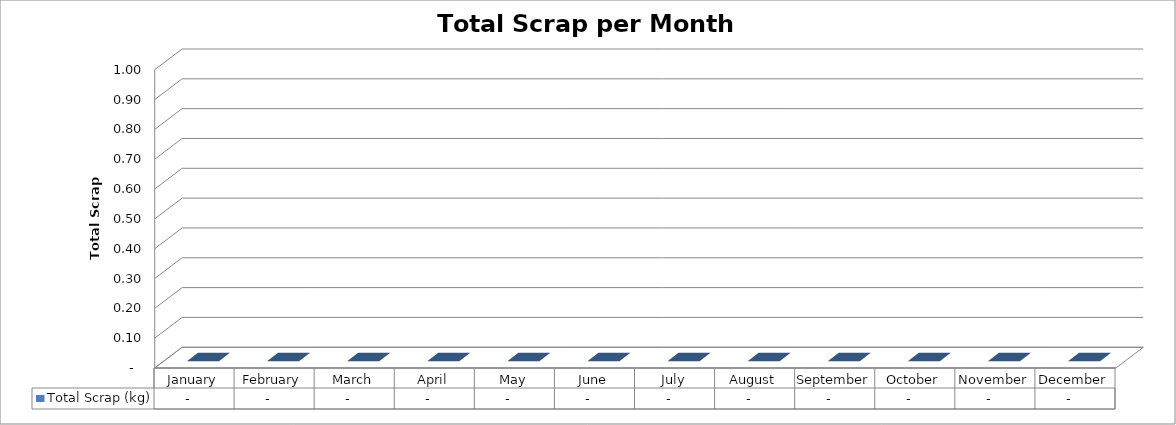
| Category | Total Scrap (kg) |
|---|---|
| January | 0 |
| February | 0 |
| March | 0 |
| April | 0 |
| May | 0 |
| June | 0 |
| July | 0 |
| August | 0 |
| September | 0 |
| October | 0 |
| November | 0 |
| December | 0 |